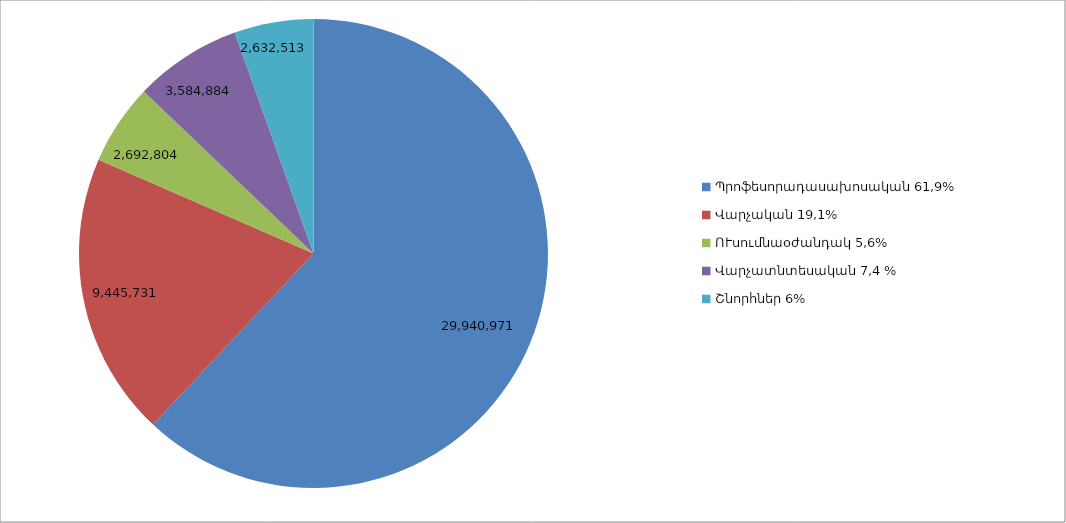
| Category | Series 0 |
|---|---|
| Պրոֆեսորադասախոսական 61,9% | 29940971 |
| Վարչական 19,1% | 9445731 |
| ՈՒսումնաօժանդակ 5,6% | 2692804 |
| Վարչատնտեսական 7,4 % | 3584884 |
| Շնորհներ 6% | 2632513 |